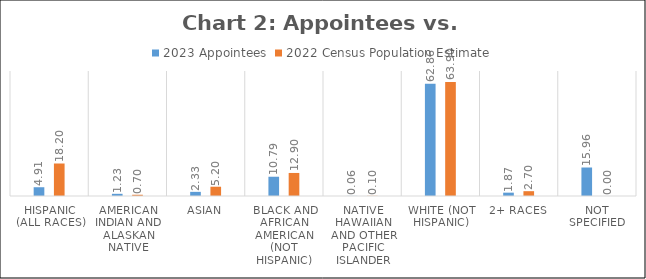
| Category | 2023 Appointees | 2022 Census Population Estimate |
|---|---|---|
| Hispanic (all races) | 4.91 | 18.2 |
| American Indian and Alaskan Native | 1.227 | 0.7 |
| Asian | 2.326 | 5.2 |
| Black and African American (not Hispanic) | 10.788 | 12.9 |
| Native Hawaiian and Other Pacific Islander | 0.065 | 0.1 |
| White (not Hispanic) | 62.855 | 63.9 |
| 2+ races | 1.873 | 2.7 |
| Not specified | 15.956 | 0 |